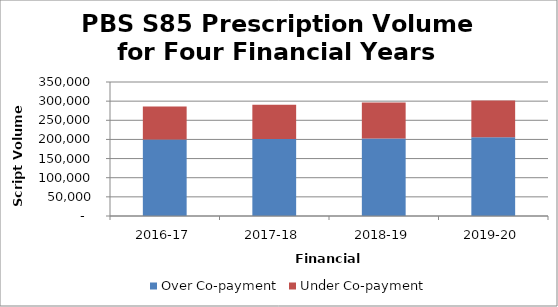
| Category | Over Co‐payment | Under Co‐payment |
|---|---|---|
| 2016-17 | 199784732 | 86196957 |
| 2017-18 | 201433697 | 89436537 |
| 2018-19 | 202302592 | 93868330 |
| 2019-20 | 205477610 | 96321324 |